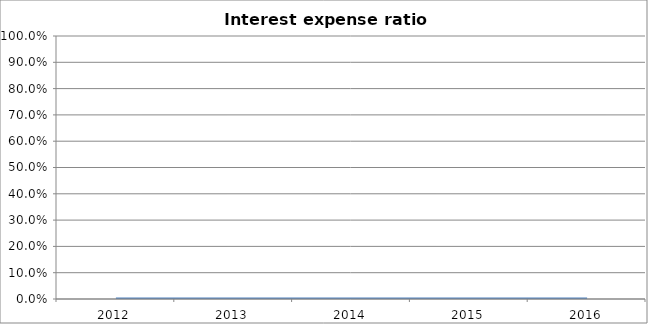
| Category | Interest expense ratio [K/H] |
|---|---|
| 2012.0 | 0 |
| 2013.0 | 0 |
| 2014.0 | 0 |
| 2015.0 | 0 |
| 2016.0 | 0 |